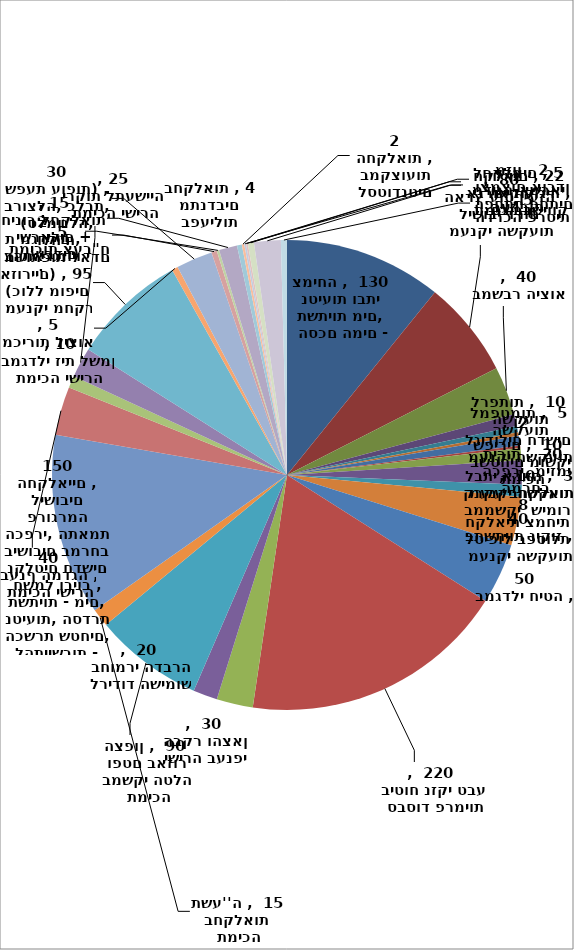
| Category | Series 0 |
|---|---|
| הסכם המים - תשתיות מים, נטיעות ובתי צמיחה | 130 |
| מענקי השקעות לישובי דרום הארץ עוטף עזה   | 80 |
| תמיכות במשבר היצוא  | 40 |
| מענקי השקעות לרפתות | 10 |
| מענקי השקעות למפטמות | 5 |
| מענקי השקעות לבתי אריזה | 3 |
| מענקי השקעות לטיפול בפסולת חקלאית צמחית | 8 |
| מענקי השקעות לגידולים חדשים | 2 |
| תמיכה בשטחים מושקי שפירים | 10 |
| פיתוח המרחב הכפרי, מיזמי תירות | 20 |
| תמיכות בממשקי  שימור קרקע בחקלאות  | 10 |
| תמיכה בתשתיות ניקוז | 40 |
| תמיכה במגדלי חיטה | 50 |
| סבסוד פרמיות ביטוח נזקי טבע | 220 |
| תמיכה ישירה בענפי הבקר והצאן | 30 |
|  מיזמים לרידוד השימוש בחומרי הדברה | 20 |
| תמיכה במשקי הטלה ופטם באזור הצפון | 90 |
| תמיכה בחקלאות תשע''ה | 15 |
| פעולות החטיבה להתיישבות - הכשרת שטחים, נטיעות, הסדרת תשתיות - מים, חשמל וביוב , נקלטים חדשים בישובים במרחב הכפרי, התאמת פרוגרמה לישובים החקלאיים | 150 |
| תמיכה ישירה בענף המדגה | 40 |
| תמיכה ישירה במגדלי זית לשמן  | 10 |
| תמיכה ישירה ירקות לתעשייה | 24.597 |
| מענקי מחקר (כולל מופים אזוריים) | 95 |
| קידום מכירות ליצוא | 5 |
| טיפול במחלות משותפות לאדם ולחיה (סלמונלה, ברוצלה, כלבת, שפעת עופות) | 30 |
| תמיכות צעב"ח | 4.5 |
| תמיכה בהתארגנויות מגדלים | 2 |
| עידוד קליטת עובדים ישראלים + חינוך לחקלאות | 15 |
| תמיכה בפעילות מתנדבים בחקלאות | 4 |
| מלגות לסטודנטים במקצועות החקלאות | 2 |
| חקלאות תומכת סביבה - אגרואקולוגיה | 1.5 |
| הפחתת פחתים וצמצום אובדן מזון | 1.5 |
| הלוואות בערבות מדינה-אשראי לחקלאים | 5 |
| תמיכה בשיווק ישיר ע"י חקלאים | 22 |
| הדרכה פרטית  | 5 |